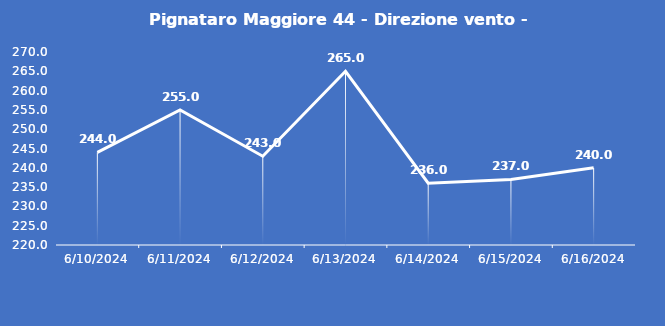
| Category | Pignataro Maggiore 44 - Direzione vento - Grezzo (°N) |
|---|---|
| 6/10/24 | 244 |
| 6/11/24 | 255 |
| 6/12/24 | 243 |
| 6/13/24 | 265 |
| 6/14/24 | 236 |
| 6/15/24 | 237 |
| 6/16/24 | 240 |